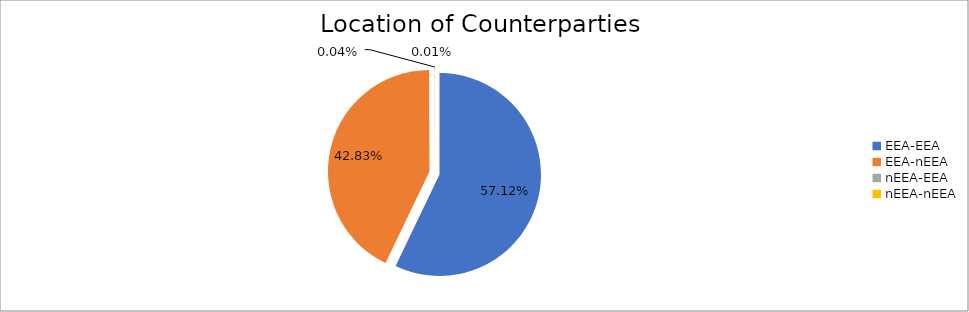
| Category | Series 0 |
|---|---|
| EEA-EEA | 7236860.903 |
| EEA-nEEA | 5425910.837 |
| nEEA-EEA | 5463.149 |
| nEEA-nEEA | 980.012 |